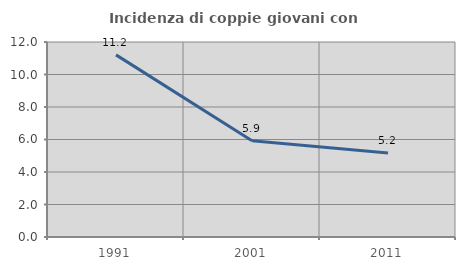
| Category | Incidenza di coppie giovani con figli |
|---|---|
| 1991.0 | 11.207 |
| 2001.0 | 5.919 |
| 2011.0 | 5.172 |